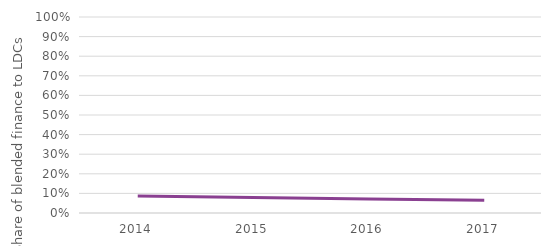
| Category | LDC |
|---|---|
| 2014.0 | 0.086 |
| 2015.0 | 0.079 |
| 2016.0 | 0.071 |
| 2017.0 | 0.065 |